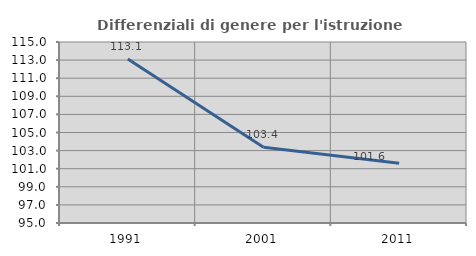
| Category | Differenziali di genere per l'istruzione superiore |
|---|---|
| 1991.0 | 113.125 |
| 2001.0 | 103.38 |
| 2011.0 | 101.608 |